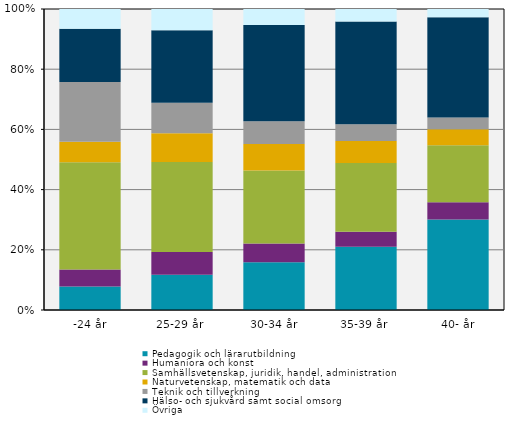
| Category | Pedagogik och lärarutbildning | Humaniora och konst | Samhällsvetenskap, juridik, handel, administration | Naturvetenskap, matematik och data | Teknik och tillverkning | Hälso- och sjukvård samt social omsorg | Övriga |
|---|---|---|---|---|---|---|---|
| -24 år | 7.845 | 5.655 | 35.803 | 6.818 | 19.945 | 17.774 | 6.576 |
| 25-29 år  | 11.807 | 7.598 | 30.087 | 9.634 | 10.197 | 24.312 | 7.095 |
| 30-34 år | 15.944 | 6.296 | 24.334 | 8.837 | 7.656 | 32.156 | 5.313 |
| 35-39 år  | 21.117 | 4.988 | 22.99 | 7.353 | 5.576 | 34.368 | 4.142 |
| 40- år | 30.189 | 5.722 | 19.007 | 5.359 | 3.843 | 33.421 | 2.768 |